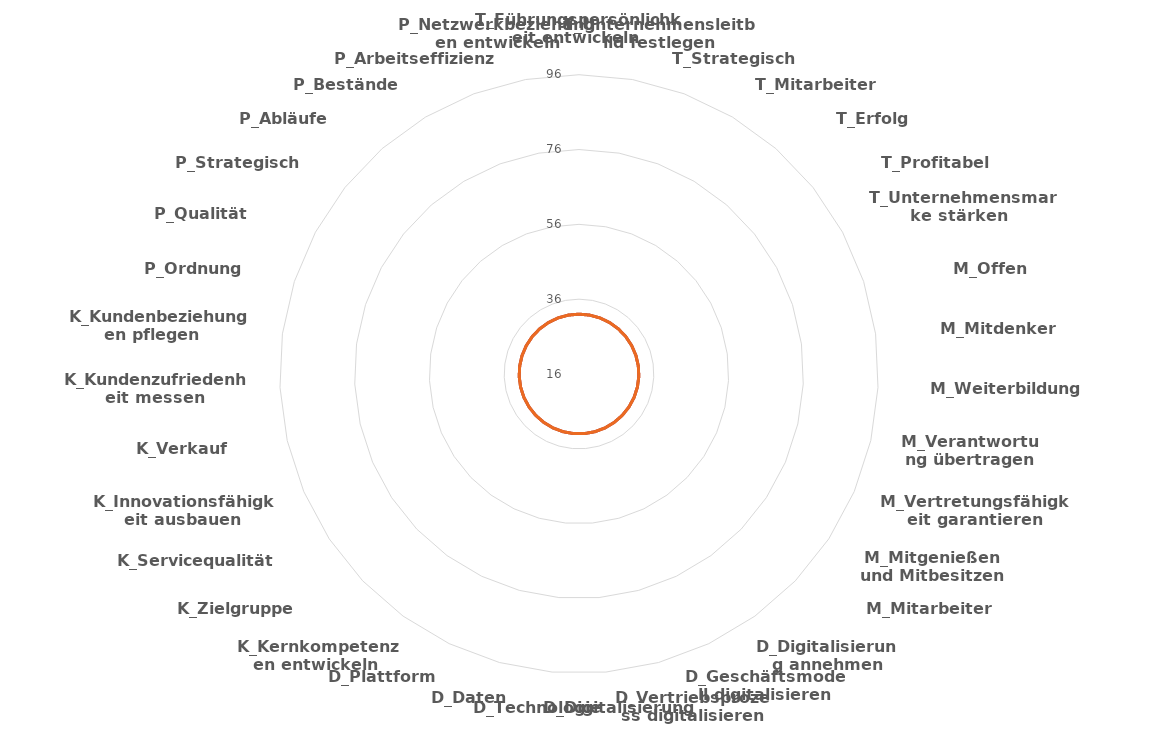
| Category | Series 1 | Series 0 |
|---|---|---|
| T_Führungspersönlichkeit entwickeln  | 0 | 0 |
| T_Unternehmensleitbild festlegen | 0 | 0 |
| T_Strategisch planen | 0 | 0 |
| T_Mitarbeiter auswählen | 0 | 0 |
| T_Erfolg vereinbaren | 0 | 0 |
| T_Profitabel wirtschaften | 0 | 0 |
| T_Unternehmensmarke stärken   | 0 | 0 |
| M_Offen kommunizieren | 0 | 0 |
| M_Mitdenker gewinnen | 0 | 0 |
| M_Weiterbildung fördern | 0 | 0 |
| M_Verantwortung übertragen | 0 | 0 |
| M_Vertretungsfähigkeit garantieren | 0 | 0 |
| M_Mitgenießen und Mitbesitzen | 0 | 0 |
| M_Mitarbeiter wertschätzen | 0 | 0 |
| D_Digitalisierung annehmen | 0 | 0 |
| D_Geschäftsmodell digitalisieren | 0 | 0 |
| D_Vertriebsprozess digitalisieren | 0 | 0 |
| D_Digitalisierung schulen | 0 | 0 |
| D_Technologie einsetzen | 0 | 0 |
| D_Daten nutzen | 0 | 0 |
| D_Plattform entwickeln | 0 | 0 |
| K_Kernkompetenzen entwickeln  | 0 | 0 |
| K_Zielgruppe fokussieren  | 0 | 0 |
| K_Servicequalität steigern  | 0 | 0 |
| K_Innovationsfähigkeit ausbauen  | 0 | 0 |
| K_Verkauf stärken  | 0 | 0 |
| K_Kundenzufriedenheit messen  | 0 | 0 |
| K_Kundenbeziehungen pflegen    | 0 | 0 |
| P_Ordnung halten | 0 | 0 |
| P_Qualität verbessern | 0 | 0 |
| P_Strategisch planen | 0 | 0 |
| P_Abläufe optimieren | 0 | 0 |
| P_Bestände reduzieren | 0 | 0 |
| P_Arbeitseffizienz messen | 0 | 0 |
| P_Netzwerkbeziehungen entwickeln | 0 | 0 |